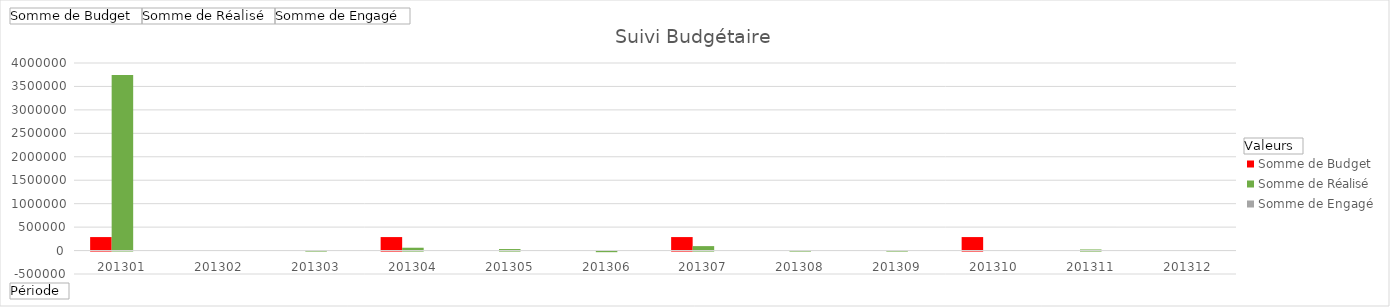
| Category | Somme de Budget | Somme de Réalisé | Somme de Engagé |
|---|---|---|---|
| 201301 | 287500 | 3745747.71 | 0 |
| 201302 | 0 | 0 | 0 |
| 201303 | 0 | 11366.54 | 0 |
| 201304 | 287500 | 60300 | 0 |
| 201305 | 0 | 32177 | 0 |
| 201306 | 0 | -13500 | 0 |
| 201307 | 287500 | 94718 | 0 |
| 201308 | 0 | 720 | 0 |
| 201309 | 0 | 2830 | 0 |
| 201310 | 287500 | 0 | 0 |
| 201311 | 0 | 23100 | 0 |
| 201312 | 0 | 0 | 0 |